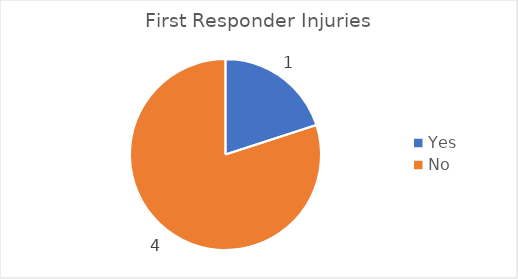
| Category | Series 0 |
|---|---|
| Yes | 1 |
| No | 4 |